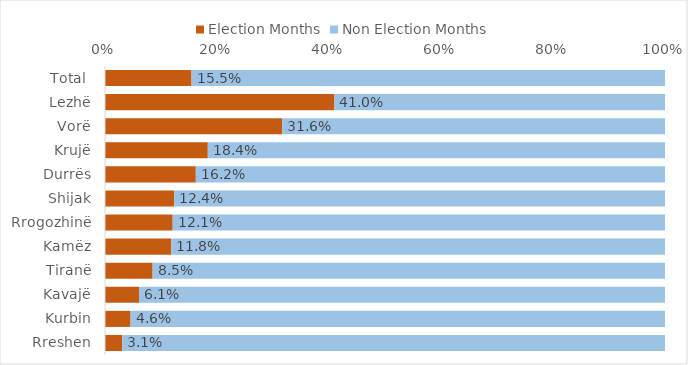
| Category | Election Months | Non Election Months |
|---|---|---|
| Total  | 0.155 | 0.845 |
| Lezhë | 0.41 | 0.59 |
| Vorë | 0.316 | 0.684 |
| Krujë | 0.184 | 0.816 |
| Durrës | 0.162 | 0.838 |
| Shijak | 0.124 | 0.876 |
| Rrogozhinë | 0.121 | 0.879 |
| Kamëz | 0.118 | 0.882 |
| Tiranë | 0.085 | 0.915 |
| Kavajë | 0.061 | 0.939 |
| Kurbin | 0.046 | 0.954 |
| Rreshen | 0.031 | 0.969 |